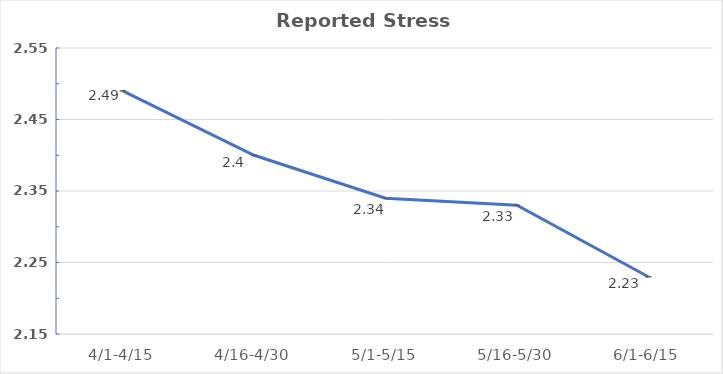
| Category | Series 0 |
|---|---|
| 4/1-4/15 | 2.49 |
| 4/16-4/30 | 2.4 |
| 5/1-5/15 | 2.34 |
| 5/16-5/30 | 2.33 |
| 6/1-6/15 | 2.23 |